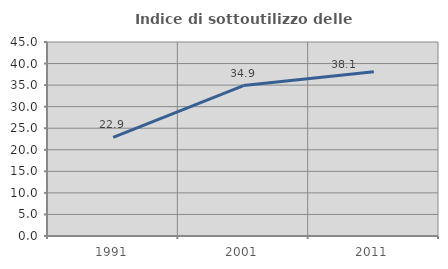
| Category | Indice di sottoutilizzo delle abitazioni  |
|---|---|
| 1991.0 | 22.898 |
| 2001.0 | 34.897 |
| 2011.0 | 38.122 |